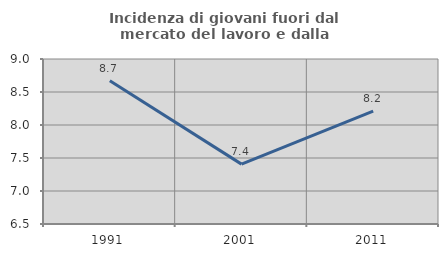
| Category | Incidenza di giovani fuori dal mercato del lavoro e dalla formazione  |
|---|---|
| 1991.0 | 8.671 |
| 2001.0 | 7.407 |
| 2011.0 | 8.21 |